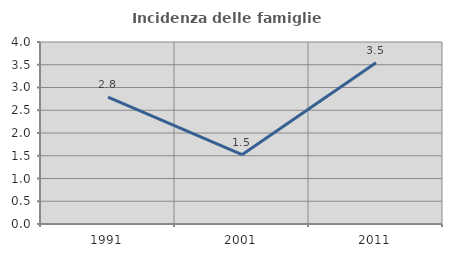
| Category | Incidenza delle famiglie numerose |
|---|---|
| 1991.0 | 2.788 |
| 2001.0 | 1.524 |
| 2011.0 | 3.543 |